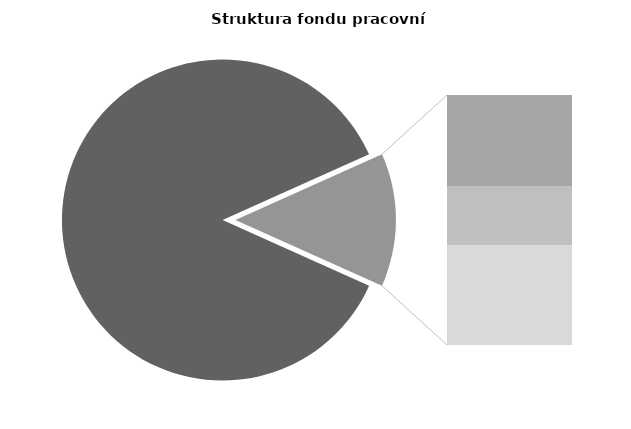
| Category | Series 0 |
|---|---|
| Průměrná měsíční 
odpracovaná doba  
bez přesčasu | 148.551 |
| Dovolená | 8.382 |
| Nemoc | 5.463 |
| Jiné | 9.169 |